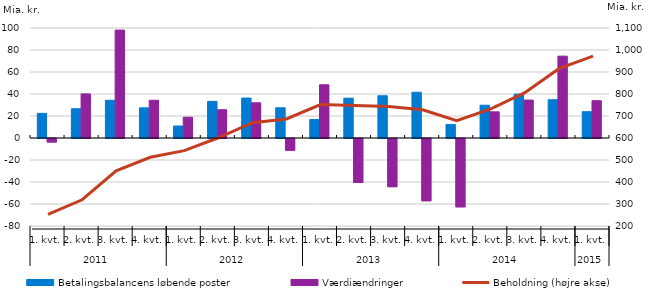
| Category | Betalingsbalancens løbende poster | Værdiændringer |
|---|---|---|
| 0 | 22.4 | -3.2 |
| 1 | 26.6 | 40.1 |
| 2 | 34.3 | 98.1 |
| 3 | 27.4 | 34.3 |
| 4 | 10.9 | 18.9 |
| 5 | 33.3 | 25.7 |
| 6 | 36.3 | 32 |
| 7 | 27.5 | -10.7 |
| 8 | 16.8 | 48.4 |
| 9 | 36.2 | -40 |
| 10 | 38.4 | -43.8 |
| 11 | 41.6 | -56.6 |
| 12 | 12.2 | -62.1 |
| 13 | 29.8 | 23.8 |
| 14 | 39.9 | 34.5 |
| 15 | 34.8 | 74.4 |
| 16 | 23.9 | 33.9 |